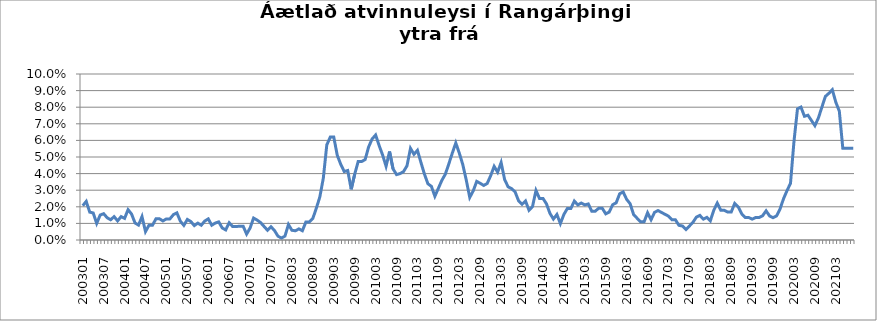
| Category | Series 0 |
|---|---|
| 200301 | 0.021 |
| 200302 | 0.023 |
| 200303 | 0.017 |
| 200304 | 0.016 |
| 200305 | 0.01 |
| 200306 | 0.015 |
| 200307 | 0.016 |
| 200308 | 0.013 |
| 200309 | 0.012 |
| 200310 | 0.014 |
| 200311 | 0.012 |
| 200312 | 0.014 |
| 200401 | 0.013 |
| 200402 | 0.018 |
| 200403 | 0.016 |
| 200404 | 0.01 |
| 200405 | 0.009 |
| 200406 | 0.014 |
| 200407 | 0.005 |
| 200408 | 0.009 |
| 200409 | 0.009 |
| 200410 | 0.013 |
| 200411 | 0.013 |
| 200412 | 0.011 |
| 200501 | 0.013 |
| 200502 | 0.013 |
| 200503 | 0.015 |
| 200504 | 0.016 |
| 200505 | 0.011 |
| 200506 | 0.009 |
| 200507 | 0.012 |
| 200508 | 0.011 |
| 200509 | 0.009 |
| 200510 | 0.01 |
| 200511 | 0.009 |
| 200512 | 0.011 |
| 200601 | 0.013 |
| 200602 | 0.009 |
| 200603 | 0.01 |
| 200604 | 0.011 |
| 200605 | 0.007 |
| 200606 | 0.006 |
| 200607 | 0.01 |
| 200608 | 0.008 |
| 200609 | 0.008 |
| 200610 | 0.008 |
| 200611 | 0.008 |
| 200612 | 0.004 |
| 200701 | 0.007 |
| 200702 | 0.013 |
| 200703 | 0.012 |
| 200704 | 0.011 |
| 200705 | 0.008 |
| 200706 | 0.006 |
| 200707 | 0.008 |
| 200708 | 0.006 |
| 200709 | 0.002 |
| 200710 | 0.001 |
| 200801 | 0.002 |
| 200802 | 0.009 |
| 200803 | 0.006 |
| 200804 | 0.006 |
| 200805 | 0.007 |
| 200806 | 0.006 |
| 200807 | 0.011 |
| 200808 | 0.011 |
| 200809 | 0.013 |
| 200810 | 0.019 |
| 200811 | 0.026 |
| 200812 | 0.037 |
| 200901 | 0.057 |
| 200902 | 0.062 |
| 200903 | 0.062 |
| 200904 | 0.051 |
| 200905 | 0.046 |
| 200906 | 0.041 |
| 200907 | 0.042 |
| 200908 | 0.031 |
| 200909 | 0.04 |
| 200910 | 0.047 |
| 200911 | 0.047 |
| 200912 | 0.048 |
| 201001 | 0.056 |
| 201002 | 0.061 |
| 201003 | 0.063 |
| 201004 | 0.057 |
| 201005 | 0.051 |
| 201006 | 0.044 |
| 201007 | 0.053 |
| 201008 | 0.043 |
| 201009 | 0.039 |
| 201010 | 0.04 |
| 201011 | 0.041 |
| 201012 | 0.045 |
| 201101 | 0.055 |
| 201102 | 0.052 |
| 201103 | 0.054 |
| 201104 | 0.047 |
| 201105 | 0.04 |
| 201106 | 0.034 |
| 201107 | 0.032 |
| 201108 | 0.026 |
| 201109 | 0.031 |
| 201110 | 0.036 |
| 201111 | 0.04 |
| 201112 | 0.046 |
| 201201 | 0.052 |
| 201202 | 0.058 |
| 201203 | 0.052 |
| 201204 | 0.045 |
| 201205 | 0.036 |
| 201206 | 0.026 |
| 201207 | 0.03 |
| 201208 | 0.035 |
| 201209 | 0.034 |
| 201210 | 0.033 |
| 201211 | 0.034 |
| 201212 | 0.039 |
| 201301 | 0.044 |
| 201302 | 0.041 |
| 201303 | 0.047 |
| 201304 | 0.036 |
| 201305 | 0.032 |
| 201306 | 0.031 |
| 201307 | 0.029 |
| 201308 | 0.024 |
| 201309 | 0.022 |
| 201310 | 0.023 |
| 201311 | 0.018 |
| 201312 | 0.02 |
| 201401 | 0.03 |
| 201402 | 0.025 |
| 201403 | 0.025 |
| 201404 | 0.022 |
| 201405 | 0.016 |
| 201406 | 0.013 |
| 201407 | 0.015 |
| 201408 | 0.01 |
| 201409 | 0.015 |
| 201410 | 0.019 |
| 201411 | 0.019 |
| 201412 | 0.023 |
| 201501 | 0.021 |
| 201502 | 0.022 |
| 201503 | 0.021 |
| 201504 | 0.022 |
| 201505 | 0.017 |
| 201506 | 0.017 |
| 201507 | 0.019 |
| 201508 | 0.019 |
| 201509 | 0.016 |
| 201510 | 0.017 |
| 201511 | 0.021 |
| 201512 | 0.022 |
| 201601 | 0.028 |
| 201602 | 0.029 |
| 201603 | 0.024 |
| 201604 | 0.022 |
| 201605 | 0.015 |
| 201606 | 0.013 |
| 201607 | 0.011 |
| 201608 | 0.011 |
| 201609 | 0.016 |
| 201610 | 0.012 |
| 201611 | 0.017 |
| 201612 | 0.018 |
| 201701 | 0.017 |
| 201702 | 0.015 |
| 201703 | 0.014 |
| 201704 | 0.012 |
| 201705 | 0.012 |
| 201706 | 0.009 |
| 201707 | 0.008 |
| 201708 | 0.006 |
| 201709 | 0.008 |
| 201710 | 0.011 |
| 201711 | 0.014 |
| 201712 | 0.015 |
| 201801 | 0.013 |
| 201802 | 0.014 |
| 201803 | 0.012 |
| 201804 | 0.018 |
| 201805 | 0.022 |
| 201806 | 0.018 |
| 201807 | 0.018 |
| 201808 | 0.017 |
| 201809 | 0.017 |
| 201810 | 0.022 |
| 201811 | 0.02 |
| 201812 | 0.016 |
| 201901 | 0.014 |
| 201902 | 0.014 |
| 201903 | 0.013 |
| 201904 | 0.014 |
| 201905 | 0.014 |
| 201906 | 0.015 |
| 201907 | 0.018 |
| 201908 | 0.014 |
| 201909 | 0.013 |
| 201910 | 0.015 |
| 201911 | 0.019 |
| 201912 | 0.025 |
| 202001 | 0.03 |
| 202002 | 0.034 |
| 202003 | 0.059 |
| 202004 | 0.079 |
| 202005 | 0.08 |
| 202006 | 0.075 |
| 202007 | 0.075 |
| 202008 | 0.072 |
| 202009 | 0.069 |
| 202010 | 0.074 |
| 202011 | 0.08 |
| 202012 | 0.086 |
| 202101 | 0.088 |
| 202102 | 0.091 |
| 202103 | 0.083 |
| 202104 | 0.078 |
| 202105 | 0.055 |
| 202106 | 0.055 |
| 202107 | 0.055 |
| 202108 | 0.055 |